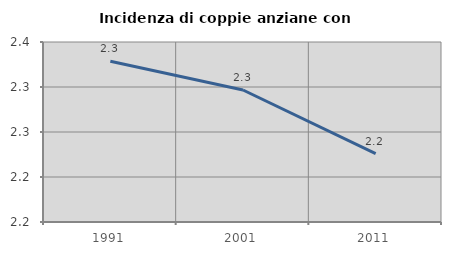
| Category | Incidenza di coppie anziane con figli |
|---|---|
| 1991.0 | 2.329 |
| 2001.0 | 2.297 |
| 2011.0 | 2.226 |